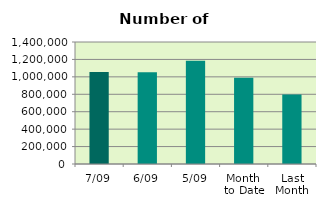
| Category | Series 0 |
|---|---|
| 7/09 | 1055998 |
| 6/09 | 1054156 |
| 5/09 | 1184024 |
| Month 
to Date | 989669.6 |
| Last
Month | 797310 |